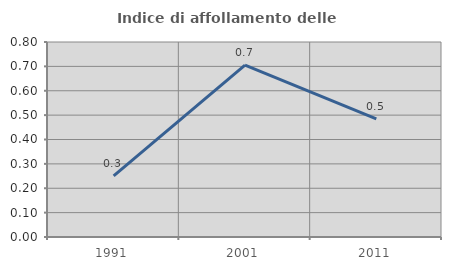
| Category | Indice di affollamento delle abitazioni  |
|---|---|
| 1991.0 | 0.251 |
| 2001.0 | 0.705 |
| 2011.0 | 0.484 |